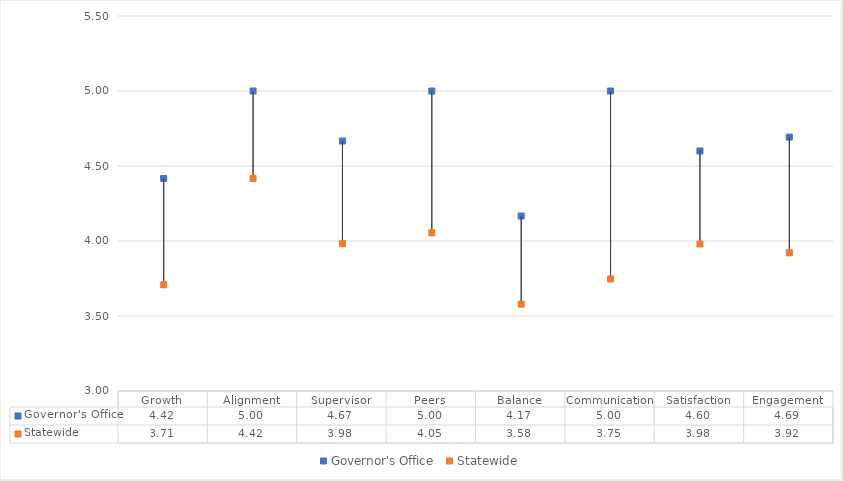
| Category | Governor's Office | Statewide |
|---|---|---|
| Growth | 4.417 | 3.708 |
| Alignment | 5 | 4.417 |
| Supervisor | 4.667 | 3.983 |
| Peers | 5 | 4.054 |
| Balance | 4.167 | 3.579 |
| Communication | 5 | 3.747 |
| Satisfaction | 4.6 | 3.98 |
| Engagement | 4.693 | 3.921 |